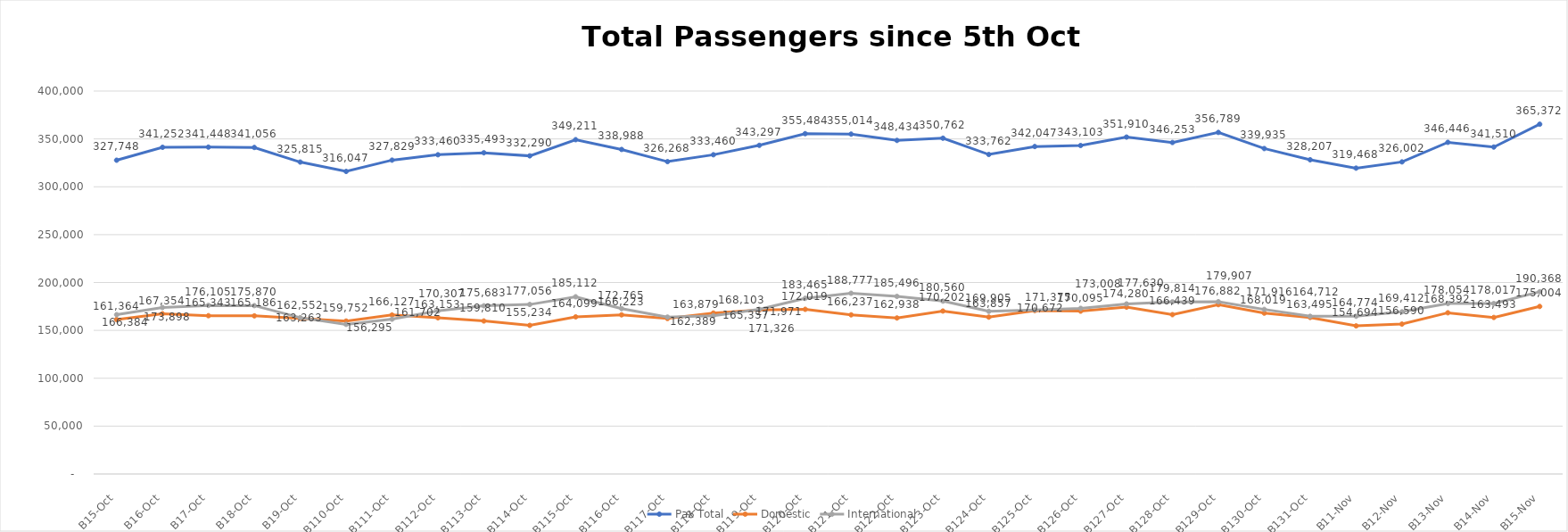
| Category | Pax Total | Domestic | International |
|---|---|---|---|
| 2023-10-05 | 327748 | 161364 | 166384 |
| 2023-10-06 | 341252 | 167354 | 173898 |
| 2023-10-07 | 341448 | 165343 | 176105 |
| 2023-10-08 | 341056 | 165186 | 175870 |
| 2023-10-09 | 325815 | 162552 | 163263 |
| 2023-10-10 | 316047 | 159752 | 156295 |
| 2023-10-11 | 327829 | 166127 | 161702 |
| 2023-10-12 | 333460 | 163153 | 170307 |
| 2023-10-13 | 335493 | 159810 | 175683 |
| 2023-10-14 | 332290 | 155234 | 177056 |
| 2023-10-15 | 349211 | 164099 | 185112 |
| 2023-10-16 | 338988 | 166223 | 172765 |
| 2023-10-17 | 326268 | 162389 | 163879 |
| 2023-10-18 | 333460 | 168103 | 165357 |
| 2023-10-19 | 343297 | 171326 | 171971 |
| 2023-10-20 | 355484 | 172019 | 183465 |
| 2023-10-21 | 355014 | 166237 | 188777 |
| 2023-10-22 | 348434 | 162938 | 185496 |
| 2023-10-23 | 350762 | 170202 | 180560 |
| 2023-10-24 | 333762 | 163857 | 169905 |
| 2023-10-25 | 342047 | 170672 | 171375 |
| 2023-10-26 | 343103 | 170095 | 173008 |
| 2023-10-27 | 351910 | 174280 | 177630 |
| 2023-10-28 | 346253 | 166439 | 179814 |
| 2023-10-29 | 356789 | 176882 | 179907 |
| 2023-10-30 | 339935 | 168019 | 171916 |
| 2023-10-31 | 328207 | 163495 | 164712 |
| 2023-11-01 | 319468 | 154694 | 164774 |
| 2023-11-02 | 326002 | 156590 | 169412 |
| 2023-11-03 | 346446 | 168392 | 178054 |
| 2023-11-04 | 341510 | 163493 | 178017 |
| 2023-11-05 | 365372 | 175004 | 190368 |